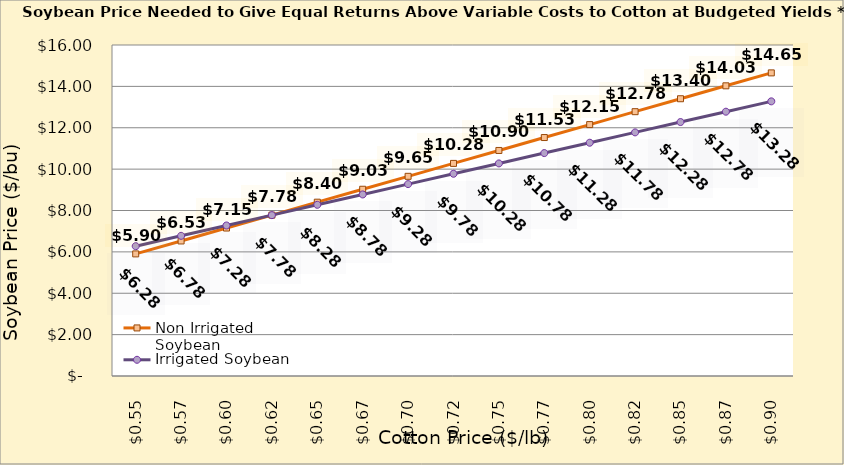
| Category | Non Irrigated Soybean | Irrigated Soybean |
|---|---|---|
| 0.5449999999999998 | 5.902 | 6.276 |
| 0.5699999999999998 | 6.527 | 6.776 |
| 0.5949999999999999 | 7.152 | 7.276 |
| 0.6199999999999999 | 7.777 | 7.776 |
| 0.6449999999999999 | 8.402 | 8.276 |
| 0.6699999999999999 | 9.027 | 8.776 |
| 0.695 | 9.652 | 9.276 |
| 0.72 | 10.277 | 9.776 |
| 0.745 | 10.902 | 10.276 |
| 0.77 | 11.527 | 10.776 |
| 0.795 | 12.152 | 11.276 |
| 0.8200000000000001 | 12.777 | 11.776 |
| 0.8450000000000001 | 13.402 | 12.276 |
| 0.8700000000000001 | 14.027 | 12.776 |
| 0.8950000000000001 | 14.652 | 13.276 |